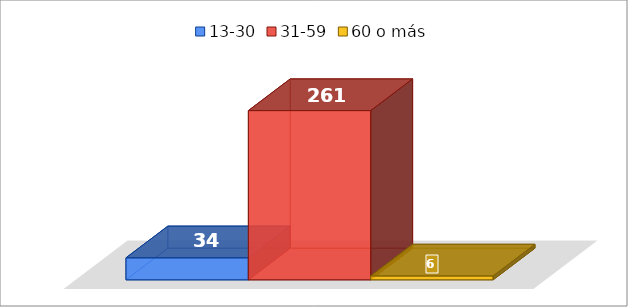
| Category | 13-30 | 31-59 | 60 o más |
|---|---|---|---|
| 0 | 34 | 261 | 6 |